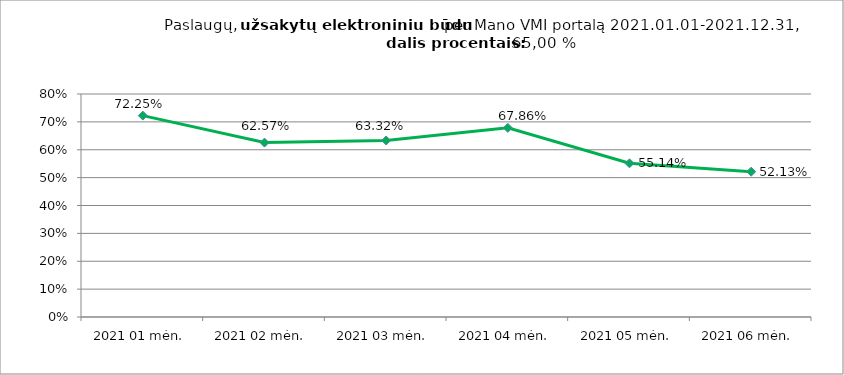
| Category | Elektroniniu būdu užsakytų paslaugų dalis procentais (lyginant su visomis Mano VMI portale užsakytomis paslaugomis) |
|---|---|
| 2021 01 mėn. | 0.722 |
| 2021 02 mėn. | 0.626 |
| 2021 03 mėn. | 0.633 |
| 2021 04 mėn. | 0.679 |
| 2021 05 mėn. | 0.551 |
| 2021 06 mėn. | 0.521 |